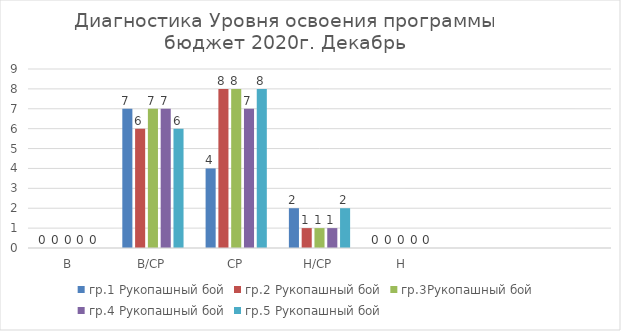
| Category | гр.1 Рукопашный бой | гр.2 Рукопашный бой | гр.3Рукопашный бой | гр.4 Рукопашный бой | гр.5 Рукопашный бой |
|---|---|---|---|---|---|
| В | 0 | 0 | 0 | 0 | 0 |
| В/СР | 7 | 6 | 7 | 7 | 6 |
| СР | 4 | 8 | 8 | 7 | 8 |
| Н/СР | 2 | 1 | 1 | 1 | 2 |
| Н | 0 | 0 | 0 | 0 | 0 |